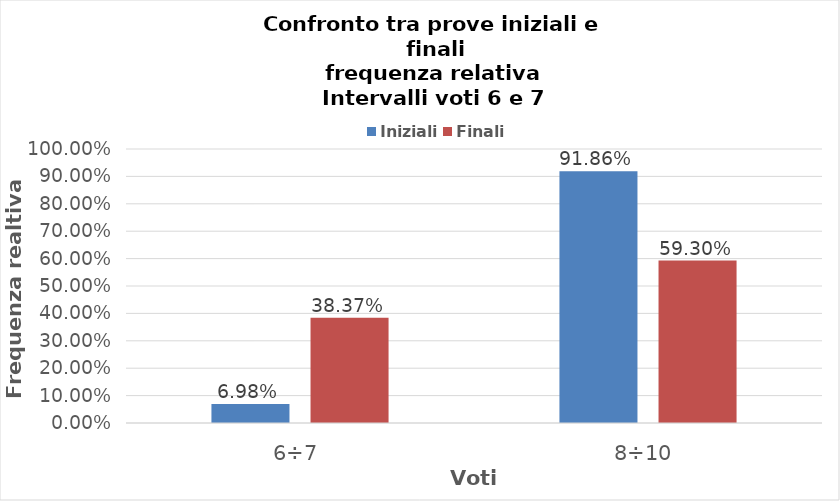
| Category | Iniziali | Finali |
|---|---|---|
| 6÷7 | 0.07 | 0.384 |
| 8÷10 | 0.919 | 0.593 |